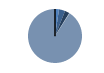
| Category | Series 0 |
|---|---|
| ARRASTRE | 18 |
| CERCO | 28 |
| PALANGRE | 21 |
| REDES DE ENMALLE | 0 |
| ARTES FIJAS | 2 |
| ARTES MENORES | 685 |
| SIN TIPO ASIGNADO | 0 |